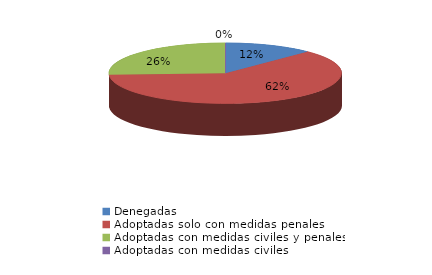
| Category | Series 0 |
|---|---|
| Denegadas | 12 |
| Adoptadas solo con medidas penales | 60 |
| Adoptadas con medidas civiles y penales | 25 |
| Adoptadas con medidas civiles | 0 |